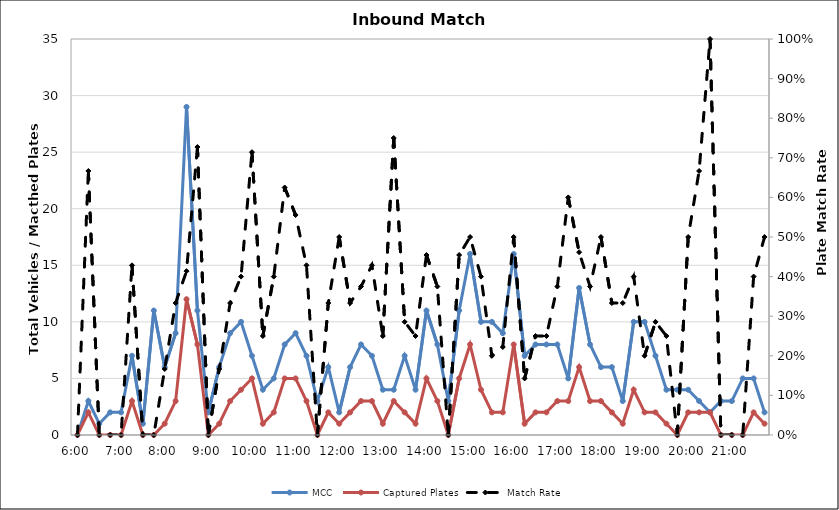
| Category | MCC | Captured Plates |
|---|---|---|
| 0.25 | 0 | 0 |
| 0.260416666666667 | 3 | 2 |
| 0.270833333333333 | 1 | 0 |
| 0.28125 | 2 | 0 |
| 0.291666666666667 | 2 | 0 |
| 0.302083333333333 | 7 | 3 |
| 0.3125 | 1 | 0 |
| 0.322916666666667 | 11 | 0 |
| 0.333333333333333 | 6 | 1 |
| 0.34375 | 9 | 3 |
| 0.354166666666667 | 29 | 12 |
| 0.364583333333333 | 11 | 8 |
| 0.375 | 2 | 0 |
| 0.385416666666667 | 6 | 1 |
| 0.395833333333333 | 9 | 3 |
| 0.40625 | 10 | 4 |
| 0.416666666666667 | 7 | 5 |
| 0.427083333333333 | 4 | 1 |
| 0.4375 | 5 | 2 |
| 0.447916666666667 | 8 | 5 |
| 0.458333333333333 | 9 | 5 |
| 0.46875 | 7 | 3 |
| 0.479166666666667 | 3 | 0 |
| 0.489583333333333 | 6 | 2 |
| 0.5 | 2 | 1 |
| 0.510416666666667 | 6 | 2 |
| 0.520833333333333 | 8 | 3 |
| 0.53125 | 7 | 3 |
| 0.541666666666667 | 4 | 1 |
| 0.552083333333333 | 4 | 3 |
| 0.5625 | 7 | 2 |
| 0.572916666666667 | 4 | 1 |
| 0.583333333333333 | 11 | 5 |
| 0.59375 | 8 | 3 |
| 0.604166666666667 | 3 | 0 |
| 0.614583333333333 | 11 | 5 |
| 0.625 | 16 | 8 |
| 0.635416666666667 | 10 | 4 |
| 0.645833333333333 | 10 | 2 |
| 0.65625 | 9 | 2 |
| 0.666666666666667 | 16 | 8 |
| 0.677083333333333 | 7 | 1 |
| 0.6875 | 8 | 2 |
| 0.697916666666667 | 8 | 2 |
| 0.708333333333333 | 8 | 3 |
| 0.71875 | 5 | 3 |
| 0.729166666666667 | 13 | 6 |
| 0.739583333333333 | 8 | 3 |
| 0.75 | 6 | 3 |
| 0.760416666666667 | 6 | 2 |
| 0.770833333333333 | 3 | 1 |
| 0.78125 | 10 | 4 |
| 0.791666666666667 | 10 | 2 |
| 0.802083333333333 | 7 | 2 |
| 0.8125 | 4 | 1 |
| 0.822916666666667 | 4 | 0 |
| 0.833333333333333 | 4 | 2 |
| 0.84375 | 3 | 2 |
| 0.854166666666667 | 2 | 2 |
| 0.864583333333333 | 3 | 0 |
| 0.875 | 3 | 0 |
| 0.885416666666667 | 5 | 0 |
| 0.895833333333333 | 5 | 2 |
| 0.90625 | 2 | 1 |